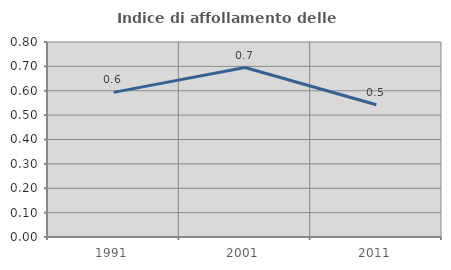
| Category | Indice di affollamento delle abitazioni  |
|---|---|
| 1991.0 | 0.593 |
| 2001.0 | 0.695 |
| 2011.0 | 0.542 |